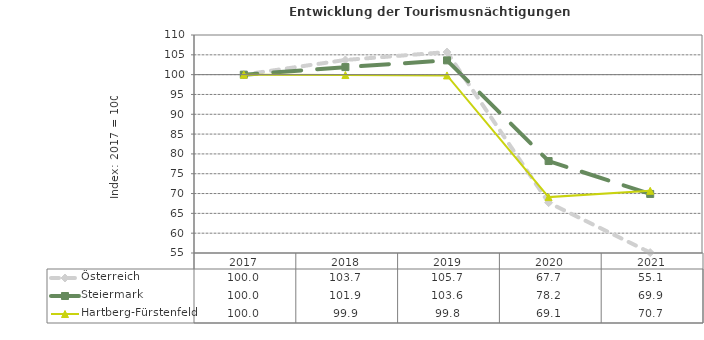
| Category | Österreich | Steiermark | Hartberg-Fürstenfeld |
|---|---|---|---|
| 2021.0 | 55.1 | 69.9 | 70.7 |
| 2020.0 | 67.7 | 78.2 | 69.1 |
| 2019.0 | 105.7 | 103.6 | 99.8 |
| 2018.0 | 103.7 | 101.9 | 99.9 |
| 2017.0 | 100 | 100 | 100 |